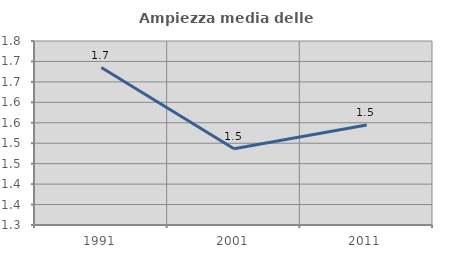
| Category | Ampiezza media delle famiglie |
|---|---|
| 1991.0 | 1.685 |
| 2001.0 | 1.487 |
| 2011.0 | 1.545 |